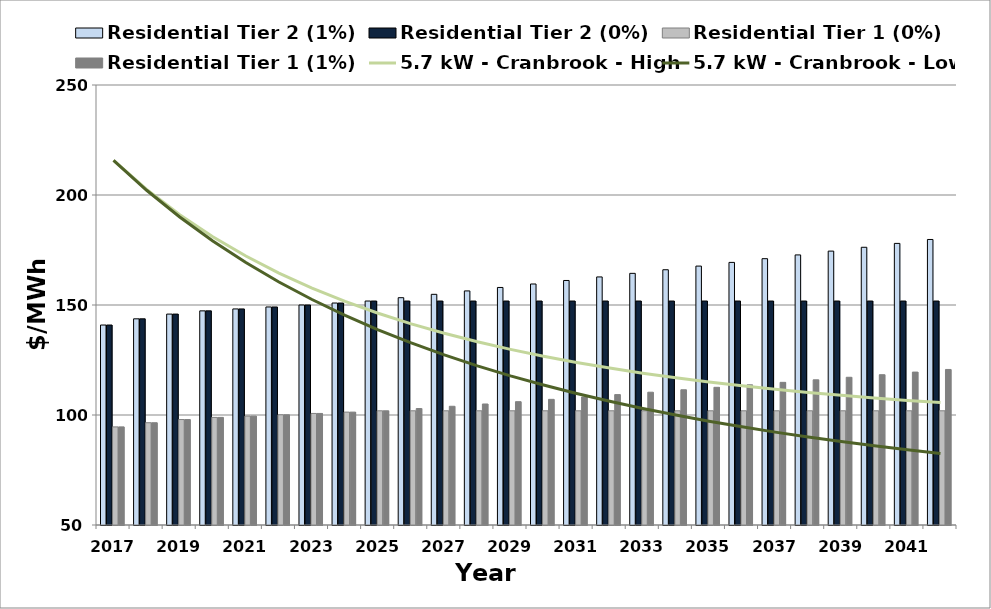
| Category | Residential Tier 2 (1%) | Residential Tier 2 (0%) | Residential Tier 1 (0%) | Residential Tier 1 (1%) |
|---|---|---|---|---|
| 2017.0 | 140.9 | 140.9 | 94.594 | 94.594 |
| 2018.0 | 143.717 | 143.717 | 96.486 | 96.486 |
| 2019.0 | 145.873 | 145.873 | 97.934 | 97.934 |
| 2020.0 | 147.332 | 147.332 | 98.913 | 98.913 |
| 2021.0 | 148.216 | 148.216 | 99.507 | 99.507 |
| 2022.0 | 149.105 | 149.105 | 100.104 | 100.104 |
| 2023.0 | 150 | 150 | 100.704 | 100.704 |
| 2024.0 | 150.9 | 150.9 | 101.308 | 101.308 |
| 2025.0 | 151.805 | 151.805 | 101.916 | 101.916 |
| 2026.0 | 153.323 | 151.805 | 101.916 | 102.935 |
| 2027.0 | 154.857 | 151.805 | 101.916 | 103.965 |
| 2028.0 | 156.405 | 151.805 | 101.916 | 105.004 |
| 2029.0 | 157.969 | 151.805 | 101.916 | 106.054 |
| 2030.0 | 159.549 | 151.805 | 101.916 | 107.115 |
| 2031.0 | 161.144 | 151.805 | 101.916 | 108.186 |
| 2032.0 | 162.756 | 151.805 | 101.916 | 109.268 |
| 2033.0 | 164.383 | 151.805 | 101.916 | 110.361 |
| 2034.0 | 166.027 | 151.805 | 101.916 | 111.464 |
| 2035.0 | 167.687 | 151.805 | 101.916 | 112.579 |
| 2036.0 | 169.364 | 151.805 | 101.916 | 113.705 |
| 2037.0 | 171.058 | 151.805 | 101.916 | 114.842 |
| 2038.0 | 172.769 | 151.805 | 101.916 | 115.99 |
| 2039.0 | 174.496 | 151.805 | 101.916 | 117.15 |
| 2040.0 | 176.241 | 151.805 | 101.916 | 118.322 |
| 2041.0 | 178.004 | 151.805 | 101.916 | 119.505 |
| 2042.0 | 179.784 | 151.805 | 101.916 | 120.7 |